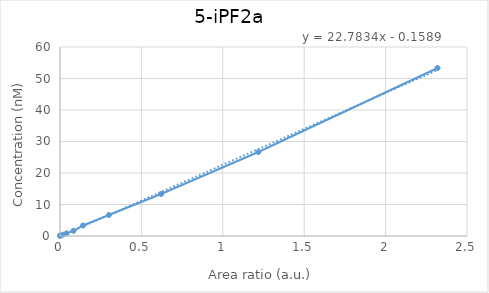
| Category | 5-iPF2a |
|---|---|
| 0.0 | 0 |
| 0.000487578981683403 | 0.208 |
| 0.0182077100776351 | 0.417 |
| 0.0401189871199917 | 0.833 |
| 0.0831371122019674 | 1.667 |
| 0.14128097538754 | 3.333 |
| 0.300476695790215 | 6.667 |
| 0.620964845333486 | 13.333 |
| 1.2184945612056 | 26.667 |
| 2.31919590999558 | 53.333 |